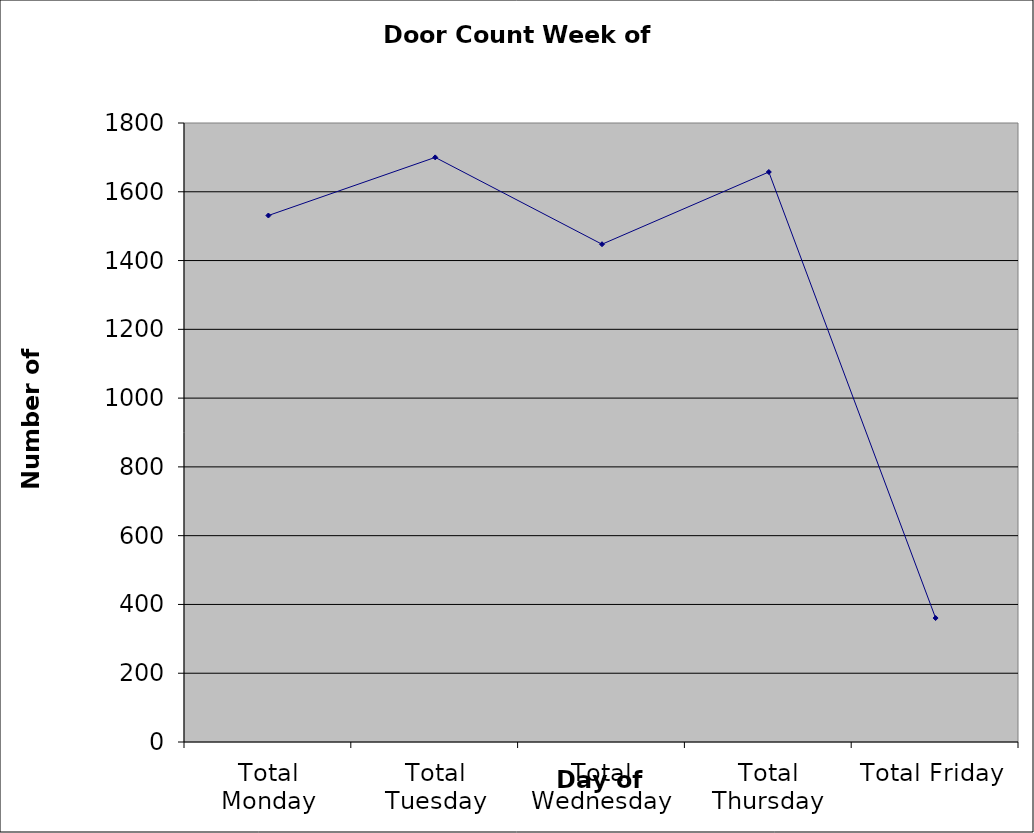
| Category | Series 0 |
|---|---|
| Total Monday | 1531 |
| Total Tuesday | 1700 |
| Total Wednesday | 1447.5 |
| Total Thursday | 1657.5 |
| Total Friday | 360.5 |